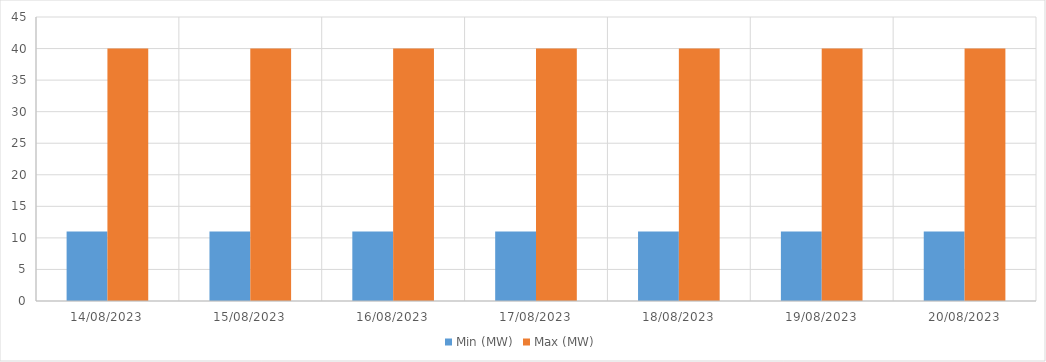
| Category | Min (MW) | Max (MW) |
|---|---|---|
| 14/08/2023 | 11 | 40 |
| 15/08/2023 | 11 | 40 |
| 16/08/2023 | 11 | 40 |
| 17/08/2023 | 11 | 40 |
| 18/08/2023 | 11 | 40 |
| 19/08/2023 | 11 | 40 |
| 20/08/2023 | 11 | 40 |